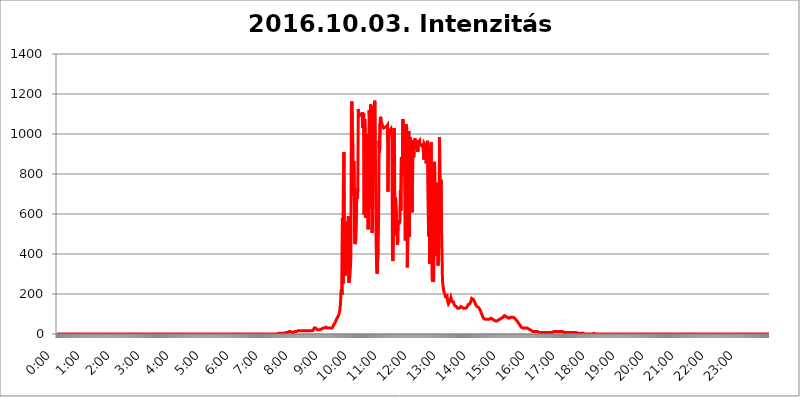
| Category | 2016.10.03. Intenzitás [W/m^2] |
|---|---|
| 0.0 | 0 |
| 0.0006944444444444445 | 0 |
| 0.001388888888888889 | 0 |
| 0.0020833333333333333 | 0 |
| 0.002777777777777778 | 0 |
| 0.003472222222222222 | 0 |
| 0.004166666666666667 | 0 |
| 0.004861111111111111 | 0 |
| 0.005555555555555556 | 0 |
| 0.0062499999999999995 | 0 |
| 0.006944444444444444 | 0 |
| 0.007638888888888889 | 0 |
| 0.008333333333333333 | 0 |
| 0.009027777777777779 | 0 |
| 0.009722222222222222 | 0 |
| 0.010416666666666666 | 0 |
| 0.011111111111111112 | 0 |
| 0.011805555555555555 | 0 |
| 0.012499999999999999 | 0 |
| 0.013194444444444444 | 0 |
| 0.013888888888888888 | 0 |
| 0.014583333333333332 | 0 |
| 0.015277777777777777 | 0 |
| 0.015972222222222224 | 0 |
| 0.016666666666666666 | 0 |
| 0.017361111111111112 | 0 |
| 0.018055555555555557 | 0 |
| 0.01875 | 0 |
| 0.019444444444444445 | 0 |
| 0.02013888888888889 | 0 |
| 0.020833333333333332 | 0 |
| 0.02152777777777778 | 0 |
| 0.022222222222222223 | 0 |
| 0.02291666666666667 | 0 |
| 0.02361111111111111 | 0 |
| 0.024305555555555556 | 0 |
| 0.024999999999999998 | 0 |
| 0.025694444444444447 | 0 |
| 0.02638888888888889 | 0 |
| 0.027083333333333334 | 0 |
| 0.027777777777777776 | 0 |
| 0.02847222222222222 | 0 |
| 0.029166666666666664 | 0 |
| 0.029861111111111113 | 0 |
| 0.030555555555555555 | 0 |
| 0.03125 | 0 |
| 0.03194444444444445 | 0 |
| 0.03263888888888889 | 0 |
| 0.03333333333333333 | 0 |
| 0.034027777777777775 | 0 |
| 0.034722222222222224 | 0 |
| 0.035416666666666666 | 0 |
| 0.036111111111111115 | 0 |
| 0.03680555555555556 | 0 |
| 0.0375 | 0 |
| 0.03819444444444444 | 0 |
| 0.03888888888888889 | 0 |
| 0.03958333333333333 | 0 |
| 0.04027777777777778 | 0 |
| 0.04097222222222222 | 0 |
| 0.041666666666666664 | 0 |
| 0.042361111111111106 | 0 |
| 0.04305555555555556 | 0 |
| 0.043750000000000004 | 0 |
| 0.044444444444444446 | 0 |
| 0.04513888888888889 | 0 |
| 0.04583333333333334 | 0 |
| 0.04652777777777778 | 0 |
| 0.04722222222222222 | 0 |
| 0.04791666666666666 | 0 |
| 0.04861111111111111 | 0 |
| 0.049305555555555554 | 0 |
| 0.049999999999999996 | 0 |
| 0.05069444444444445 | 0 |
| 0.051388888888888894 | 0 |
| 0.052083333333333336 | 0 |
| 0.05277777777777778 | 0 |
| 0.05347222222222222 | 0 |
| 0.05416666666666667 | 0 |
| 0.05486111111111111 | 0 |
| 0.05555555555555555 | 0 |
| 0.05625 | 0 |
| 0.05694444444444444 | 0 |
| 0.057638888888888885 | 0 |
| 0.05833333333333333 | 0 |
| 0.05902777777777778 | 0 |
| 0.059722222222222225 | 0 |
| 0.06041666666666667 | 0 |
| 0.061111111111111116 | 0 |
| 0.06180555555555556 | 0 |
| 0.0625 | 0 |
| 0.06319444444444444 | 0 |
| 0.06388888888888888 | 0 |
| 0.06458333333333334 | 0 |
| 0.06527777777777778 | 0 |
| 0.06597222222222222 | 0 |
| 0.06666666666666667 | 0 |
| 0.06736111111111111 | 0 |
| 0.06805555555555555 | 0 |
| 0.06874999999999999 | 0 |
| 0.06944444444444443 | 0 |
| 0.07013888888888889 | 0 |
| 0.07083333333333333 | 0 |
| 0.07152777777777779 | 0 |
| 0.07222222222222223 | 0 |
| 0.07291666666666667 | 0 |
| 0.07361111111111111 | 0 |
| 0.07430555555555556 | 0 |
| 0.075 | 0 |
| 0.07569444444444444 | 0 |
| 0.0763888888888889 | 0 |
| 0.07708333333333334 | 0 |
| 0.07777777777777778 | 0 |
| 0.07847222222222222 | 0 |
| 0.07916666666666666 | 0 |
| 0.0798611111111111 | 0 |
| 0.08055555555555556 | 0 |
| 0.08125 | 0 |
| 0.08194444444444444 | 0 |
| 0.08263888888888889 | 0 |
| 0.08333333333333333 | 0 |
| 0.08402777777777777 | 0 |
| 0.08472222222222221 | 0 |
| 0.08541666666666665 | 0 |
| 0.08611111111111112 | 0 |
| 0.08680555555555557 | 0 |
| 0.08750000000000001 | 0 |
| 0.08819444444444445 | 0 |
| 0.08888888888888889 | 0 |
| 0.08958333333333333 | 0 |
| 0.09027777777777778 | 0 |
| 0.09097222222222222 | 0 |
| 0.09166666666666667 | 0 |
| 0.09236111111111112 | 0 |
| 0.09305555555555556 | 0 |
| 0.09375 | 0 |
| 0.09444444444444444 | 0 |
| 0.09513888888888888 | 0 |
| 0.09583333333333333 | 0 |
| 0.09652777777777777 | 0 |
| 0.09722222222222222 | 0 |
| 0.09791666666666667 | 0 |
| 0.09861111111111111 | 0 |
| 0.09930555555555555 | 0 |
| 0.09999999999999999 | 0 |
| 0.10069444444444443 | 0 |
| 0.1013888888888889 | 0 |
| 0.10208333333333335 | 0 |
| 0.10277777777777779 | 0 |
| 0.10347222222222223 | 0 |
| 0.10416666666666667 | 0 |
| 0.10486111111111111 | 0 |
| 0.10555555555555556 | 0 |
| 0.10625 | 0 |
| 0.10694444444444444 | 0 |
| 0.1076388888888889 | 0 |
| 0.10833333333333334 | 0 |
| 0.10902777777777778 | 0 |
| 0.10972222222222222 | 0 |
| 0.1111111111111111 | 0 |
| 0.11180555555555556 | 0 |
| 0.11180555555555556 | 0 |
| 0.1125 | 0 |
| 0.11319444444444444 | 0 |
| 0.11388888888888889 | 0 |
| 0.11458333333333333 | 0 |
| 0.11527777777777777 | 0 |
| 0.11597222222222221 | 0 |
| 0.11666666666666665 | 0 |
| 0.1173611111111111 | 0 |
| 0.11805555555555557 | 0 |
| 0.11944444444444445 | 0 |
| 0.12013888888888889 | 0 |
| 0.12083333333333333 | 0 |
| 0.12152777777777778 | 0 |
| 0.12222222222222223 | 0 |
| 0.12291666666666667 | 0 |
| 0.12291666666666667 | 0 |
| 0.12361111111111112 | 0 |
| 0.12430555555555556 | 0 |
| 0.125 | 0 |
| 0.12569444444444444 | 0 |
| 0.12638888888888888 | 0 |
| 0.12708333333333333 | 0 |
| 0.16875 | 0 |
| 0.12847222222222224 | 0 |
| 0.12916666666666668 | 0 |
| 0.12986111111111112 | 0 |
| 0.13055555555555556 | 0 |
| 0.13125 | 0 |
| 0.13194444444444445 | 0 |
| 0.1326388888888889 | 0 |
| 0.13333333333333333 | 0 |
| 0.13402777777777777 | 0 |
| 0.13402777777777777 | 0 |
| 0.13472222222222222 | 0 |
| 0.13541666666666666 | 0 |
| 0.1361111111111111 | 0 |
| 0.13749999999999998 | 0 |
| 0.13819444444444443 | 0 |
| 0.1388888888888889 | 0 |
| 0.13958333333333334 | 0 |
| 0.14027777777777778 | 0 |
| 0.14097222222222222 | 0 |
| 0.14166666666666666 | 0 |
| 0.1423611111111111 | 0 |
| 0.14305555555555557 | 0 |
| 0.14375000000000002 | 0 |
| 0.14444444444444446 | 0 |
| 0.1451388888888889 | 0 |
| 0.1451388888888889 | 0 |
| 0.14652777777777778 | 0 |
| 0.14722222222222223 | 0 |
| 0.14791666666666667 | 0 |
| 0.1486111111111111 | 0 |
| 0.14930555555555555 | 0 |
| 0.15 | 0 |
| 0.15069444444444444 | 0 |
| 0.15138888888888888 | 0 |
| 0.15208333333333332 | 0 |
| 0.15277777777777776 | 0 |
| 0.15347222222222223 | 0 |
| 0.15416666666666667 | 0 |
| 0.15486111111111112 | 0 |
| 0.15555555555555556 | 0 |
| 0.15625 | 0 |
| 0.15694444444444444 | 0 |
| 0.15763888888888888 | 0 |
| 0.15833333333333333 | 0 |
| 0.15902777777777777 | 0 |
| 0.15972222222222224 | 0 |
| 0.16041666666666668 | 0 |
| 0.16111111111111112 | 0 |
| 0.16180555555555556 | 0 |
| 0.1625 | 0 |
| 0.16319444444444445 | 0 |
| 0.1638888888888889 | 0 |
| 0.16458333333333333 | 0 |
| 0.16527777777777777 | 0 |
| 0.16597222222222222 | 0 |
| 0.16666666666666666 | 0 |
| 0.1673611111111111 | 0 |
| 0.16805555555555554 | 0 |
| 0.16874999999999998 | 0 |
| 0.16944444444444443 | 0 |
| 0.17013888888888887 | 0 |
| 0.1708333333333333 | 0 |
| 0.17152777777777775 | 0 |
| 0.17222222222222225 | 0 |
| 0.1729166666666667 | 0 |
| 0.17361111111111113 | 0 |
| 0.17430555555555557 | 0 |
| 0.17500000000000002 | 0 |
| 0.17569444444444446 | 0 |
| 0.1763888888888889 | 0 |
| 0.17708333333333334 | 0 |
| 0.17777777777777778 | 0 |
| 0.17847222222222223 | 0 |
| 0.17916666666666667 | 0 |
| 0.1798611111111111 | 0 |
| 0.18055555555555555 | 0 |
| 0.18125 | 0 |
| 0.18194444444444444 | 0 |
| 0.1826388888888889 | 0 |
| 0.18333333333333335 | 0 |
| 0.1840277777777778 | 0 |
| 0.18472222222222223 | 0 |
| 0.18541666666666667 | 0 |
| 0.18611111111111112 | 0 |
| 0.18680555555555556 | 0 |
| 0.1875 | 0 |
| 0.18819444444444444 | 0 |
| 0.18888888888888888 | 0 |
| 0.18958333333333333 | 0 |
| 0.19027777777777777 | 0 |
| 0.1909722222222222 | 0 |
| 0.19166666666666665 | 0 |
| 0.19236111111111112 | 0 |
| 0.19305555555555554 | 0 |
| 0.19375 | 0 |
| 0.19444444444444445 | 0 |
| 0.1951388888888889 | 0 |
| 0.19583333333333333 | 0 |
| 0.19652777777777777 | 0 |
| 0.19722222222222222 | 0 |
| 0.19791666666666666 | 0 |
| 0.1986111111111111 | 0 |
| 0.19930555555555554 | 0 |
| 0.19999999999999998 | 0 |
| 0.20069444444444443 | 0 |
| 0.20138888888888887 | 0 |
| 0.2020833333333333 | 0 |
| 0.2027777777777778 | 0 |
| 0.2034722222222222 | 0 |
| 0.2041666666666667 | 0 |
| 0.20486111111111113 | 0 |
| 0.20555555555555557 | 0 |
| 0.20625000000000002 | 0 |
| 0.20694444444444446 | 0 |
| 0.2076388888888889 | 0 |
| 0.20833333333333334 | 0 |
| 0.20902777777777778 | 0 |
| 0.20972222222222223 | 0 |
| 0.21041666666666667 | 0 |
| 0.2111111111111111 | 0 |
| 0.21180555555555555 | 0 |
| 0.2125 | 0 |
| 0.21319444444444444 | 0 |
| 0.2138888888888889 | 0 |
| 0.21458333333333335 | 0 |
| 0.2152777777777778 | 0 |
| 0.21597222222222223 | 0 |
| 0.21666666666666667 | 0 |
| 0.21736111111111112 | 0 |
| 0.21805555555555556 | 0 |
| 0.21875 | 0 |
| 0.21944444444444444 | 0 |
| 0.22013888888888888 | 0 |
| 0.22083333333333333 | 0 |
| 0.22152777777777777 | 0 |
| 0.2222222222222222 | 0 |
| 0.22291666666666665 | 0 |
| 0.2236111111111111 | 0 |
| 0.22430555555555556 | 0 |
| 0.225 | 0 |
| 0.22569444444444445 | 0 |
| 0.2263888888888889 | 0 |
| 0.22708333333333333 | 0 |
| 0.22777777777777777 | 0 |
| 0.22847222222222222 | 0 |
| 0.22916666666666666 | 0 |
| 0.2298611111111111 | 0 |
| 0.23055555555555554 | 0 |
| 0.23124999999999998 | 0 |
| 0.23194444444444443 | 0 |
| 0.23263888888888887 | 0 |
| 0.2333333333333333 | 0 |
| 0.2340277777777778 | 0 |
| 0.2347222222222222 | 0 |
| 0.2354166666666667 | 0 |
| 0.23611111111111113 | 0 |
| 0.23680555555555557 | 0 |
| 0.23750000000000002 | 0 |
| 0.23819444444444446 | 0 |
| 0.2388888888888889 | 0 |
| 0.23958333333333334 | 0 |
| 0.24027777777777778 | 0 |
| 0.24097222222222223 | 0 |
| 0.24166666666666667 | 0 |
| 0.2423611111111111 | 0 |
| 0.24305555555555555 | 0 |
| 0.24375 | 0 |
| 0.24444444444444446 | 0 |
| 0.24513888888888888 | 0 |
| 0.24583333333333335 | 0 |
| 0.2465277777777778 | 0 |
| 0.24722222222222223 | 0 |
| 0.24791666666666667 | 0 |
| 0.24861111111111112 | 0 |
| 0.24930555555555556 | 0 |
| 0.25 | 0 |
| 0.25069444444444444 | 0 |
| 0.2513888888888889 | 0 |
| 0.2520833333333333 | 0 |
| 0.25277777777777777 | 0 |
| 0.2534722222222222 | 0 |
| 0.25416666666666665 | 0 |
| 0.2548611111111111 | 0 |
| 0.2555555555555556 | 0 |
| 0.25625000000000003 | 0 |
| 0.2569444444444445 | 0 |
| 0.2576388888888889 | 0 |
| 0.25833333333333336 | 0 |
| 0.2590277777777778 | 0 |
| 0.25972222222222224 | 0 |
| 0.2604166666666667 | 0 |
| 0.2611111111111111 | 0 |
| 0.26180555555555557 | 0 |
| 0.2625 | 0 |
| 0.26319444444444445 | 0 |
| 0.2638888888888889 | 0 |
| 0.26458333333333334 | 0 |
| 0.2652777777777778 | 0 |
| 0.2659722222222222 | 0 |
| 0.26666666666666666 | 0 |
| 0.2673611111111111 | 0 |
| 0.26805555555555555 | 0 |
| 0.26875 | 0 |
| 0.26944444444444443 | 0 |
| 0.2701388888888889 | 0 |
| 0.2708333333333333 | 0 |
| 0.27152777777777776 | 0 |
| 0.2722222222222222 | 0 |
| 0.27291666666666664 | 0 |
| 0.2736111111111111 | 0 |
| 0.2743055555555555 | 0 |
| 0.27499999999999997 | 0 |
| 0.27569444444444446 | 0 |
| 0.27638888888888885 | 0 |
| 0.27708333333333335 | 0 |
| 0.2777777777777778 | 0 |
| 0.27847222222222223 | 0 |
| 0.2791666666666667 | 0 |
| 0.2798611111111111 | 0 |
| 0.28055555555555556 | 0 |
| 0.28125 | 0 |
| 0.28194444444444444 | 0 |
| 0.2826388888888889 | 0 |
| 0.2833333333333333 | 0 |
| 0.28402777777777777 | 0 |
| 0.2847222222222222 | 0 |
| 0.28541666666666665 | 0 |
| 0.28611111111111115 | 0 |
| 0.28680555555555554 | 0 |
| 0.28750000000000003 | 0 |
| 0.2881944444444445 | 0 |
| 0.2888888888888889 | 0 |
| 0.28958333333333336 | 0 |
| 0.2902777777777778 | 0 |
| 0.29097222222222224 | 0 |
| 0.2916666666666667 | 0 |
| 0.2923611111111111 | 0 |
| 0.29305555555555557 | 0 |
| 0.29375 | 0 |
| 0.29444444444444445 | 0 |
| 0.2951388888888889 | 0 |
| 0.29583333333333334 | 0 |
| 0.2965277777777778 | 0 |
| 0.2972222222222222 | 0 |
| 0.29791666666666666 | 0 |
| 0.2986111111111111 | 0 |
| 0.29930555555555555 | 0 |
| 0.3 | 0 |
| 0.30069444444444443 | 0 |
| 0.3013888888888889 | 0 |
| 0.3020833333333333 | 0 |
| 0.30277777777777776 | 0 |
| 0.3034722222222222 | 0 |
| 0.30416666666666664 | 0 |
| 0.3048611111111111 | 0 |
| 0.3055555555555555 | 0 |
| 0.30624999999999997 | 0 |
| 0.3069444444444444 | 0 |
| 0.3076388888888889 | 0 |
| 0.30833333333333335 | 0 |
| 0.3090277777777778 | 3.525 |
| 0.30972222222222223 | 3.525 |
| 0.3104166666666667 | 3.525 |
| 0.3111111111111111 | 3.525 |
| 0.31180555555555556 | 3.525 |
| 0.3125 | 3.525 |
| 0.31319444444444444 | 3.525 |
| 0.3138888888888889 | 3.525 |
| 0.3145833333333333 | 3.525 |
| 0.31527777777777777 | 3.525 |
| 0.3159722222222222 | 3.525 |
| 0.31666666666666665 | 3.525 |
| 0.31736111111111115 | 3.525 |
| 0.31805555555555554 | 3.525 |
| 0.31875000000000003 | 3.525 |
| 0.3194444444444445 | 3.525 |
| 0.3201388888888889 | 7.887 |
| 0.32083333333333336 | 7.887 |
| 0.3215277777777778 | 7.887 |
| 0.32222222222222224 | 7.887 |
| 0.3229166666666667 | 7.887 |
| 0.3236111111111111 | 7.887 |
| 0.32430555555555557 | 7.887 |
| 0.325 | 12.257 |
| 0.32569444444444445 | 12.257 |
| 0.3263888888888889 | 12.257 |
| 0.32708333333333334 | 12.257 |
| 0.3277777777777778 | 12.257 |
| 0.3284722222222222 | 12.257 |
| 0.32916666666666666 | 7.887 |
| 0.3298611111111111 | 7.887 |
| 0.33055555555555555 | 7.887 |
| 0.33125 | 7.887 |
| 0.33194444444444443 | 12.257 |
| 0.3326388888888889 | 12.257 |
| 0.3333333333333333 | 12.257 |
| 0.3340277777777778 | 12.257 |
| 0.3347222222222222 | 12.257 |
| 0.3354166666666667 | 12.257 |
| 0.3361111111111111 | 12.257 |
| 0.3368055555555556 | 12.257 |
| 0.33749999999999997 | 16.636 |
| 0.33819444444444446 | 16.636 |
| 0.33888888888888885 | 16.636 |
| 0.33958333333333335 | 16.636 |
| 0.34027777777777773 | 16.636 |
| 0.34097222222222223 | 16.636 |
| 0.3416666666666666 | 16.636 |
| 0.3423611111111111 | 16.636 |
| 0.3430555555555555 | 16.636 |
| 0.34375 | 16.636 |
| 0.3444444444444445 | 16.636 |
| 0.3451388888888889 | 16.636 |
| 0.3458333333333334 | 16.636 |
| 0.34652777777777777 | 16.636 |
| 0.34722222222222227 | 16.636 |
| 0.34791666666666665 | 16.636 |
| 0.34861111111111115 | 16.636 |
| 0.34930555555555554 | 16.636 |
| 0.35000000000000003 | 16.636 |
| 0.3506944444444444 | 16.636 |
| 0.3513888888888889 | 16.636 |
| 0.3520833333333333 | 16.636 |
| 0.3527777777777778 | 16.636 |
| 0.3534722222222222 | 16.636 |
| 0.3541666666666667 | 16.636 |
| 0.3548611111111111 | 16.636 |
| 0.35555555555555557 | 16.636 |
| 0.35625 | 16.636 |
| 0.35694444444444445 | 16.636 |
| 0.3576388888888889 | 16.636 |
| 0.35833333333333334 | 16.636 |
| 0.3590277777777778 | 21.024 |
| 0.3597222222222222 | 21.024 |
| 0.36041666666666666 | 29.823 |
| 0.3611111111111111 | 29.823 |
| 0.36180555555555555 | 29.823 |
| 0.3625 | 29.823 |
| 0.36319444444444443 | 25.419 |
| 0.3638888888888889 | 25.419 |
| 0.3645833333333333 | 21.024 |
| 0.3652777777777778 | 21.024 |
| 0.3659722222222222 | 21.024 |
| 0.3666666666666667 | 21.024 |
| 0.3673611111111111 | 21.024 |
| 0.3680555555555556 | 21.024 |
| 0.36874999999999997 | 21.024 |
| 0.36944444444444446 | 21.024 |
| 0.37013888888888885 | 25.419 |
| 0.37083333333333335 | 25.419 |
| 0.37152777777777773 | 25.419 |
| 0.37222222222222223 | 25.419 |
| 0.3729166666666666 | 29.823 |
| 0.3736111111111111 | 29.823 |
| 0.3743055555555555 | 29.823 |
| 0.375 | 29.823 |
| 0.3756944444444445 | 29.823 |
| 0.3763888888888889 | 29.823 |
| 0.3770833333333334 | 34.234 |
| 0.37777777777777777 | 29.823 |
| 0.37847222222222227 | 29.823 |
| 0.37916666666666665 | 29.823 |
| 0.37986111111111115 | 29.823 |
| 0.38055555555555554 | 29.823 |
| 0.38125000000000003 | 29.823 |
| 0.3819444444444444 | 29.823 |
| 0.3826388888888889 | 29.823 |
| 0.3833333333333333 | 29.823 |
| 0.3840277777777778 | 29.823 |
| 0.3847222222222222 | 29.823 |
| 0.3854166666666667 | 29.823 |
| 0.3861111111111111 | 34.234 |
| 0.38680555555555557 | 34.234 |
| 0.3875 | 43.079 |
| 0.38819444444444445 | 47.511 |
| 0.3888888888888889 | 51.951 |
| 0.38958333333333334 | 56.398 |
| 0.3902777777777778 | 60.85 |
| 0.3909722222222222 | 65.31 |
| 0.39166666666666666 | 74.246 |
| 0.3923611111111111 | 78.722 |
| 0.39305555555555555 | 83.205 |
| 0.39375 | 87.692 |
| 0.39444444444444443 | 92.184 |
| 0.3951388888888889 | 101.184 |
| 0.3958333333333333 | 110.201 |
| 0.3965277777777778 | 128.284 |
| 0.3972222222222222 | 146.423 |
| 0.3979166666666667 | 214.746 |
| 0.3986111111111111 | 223.873 |
| 0.3993055555555556 | 196.497 |
| 0.39999999999999997 | 579.542 |
| 0.40069444444444446 | 251.251 |
| 0.40138888888888885 | 775.492 |
| 0.40208333333333335 | 909.996 |
| 0.40277777777777773 | 319.517 |
| 0.40347222222222223 | 333.113 |
| 0.4041666666666666 | 292.259 |
| 0.4048611111111111 | 296.808 |
| 0.4055555555555555 | 373.729 |
| 0.40625 | 445.129 |
| 0.4069444444444445 | 562.53 |
| 0.4076388888888889 | 431.833 |
| 0.4083333333333334 | 588.009 |
| 0.40902777777777777 | 255.813 |
| 0.40972222222222227 | 255.813 |
| 0.41041666666666665 | 287.709 |
| 0.41111111111111115 | 328.584 |
| 0.41180555555555554 | 378.224 |
| 0.41250000000000003 | 1116.426 |
| 0.4131944444444444 | 1162.571 |
| 0.4138888888888889 | 1059.756 |
| 0.4145833333333333 | 962.555 |
| 0.4152777777777778 | 691.608 |
| 0.4159722222222222 | 864.493 |
| 0.4166666666666667 | 868.305 |
| 0.4173611111111111 | 449.551 |
| 0.41805555555555557 | 453.968 |
| 0.41875 | 471.582 |
| 0.41944444444444445 | 541.121 |
| 0.4201388888888889 | 723.889 |
| 0.42083333333333334 | 675.311 |
| 0.4215277777777778 | 727.896 |
| 0.4222222222222222 | 1124.056 |
| 0.42291666666666666 | 1089.873 |
| 0.4236111111111111 | 1089.873 |
| 0.42430555555555555 | 1093.653 |
| 0.425 | 1093.653 |
| 0.42569444444444443 | 1097.437 |
| 0.4263888888888889 | 1097.437 |
| 0.4270833333333333 | 1101.226 |
| 0.4277777777777778 | 1108.816 |
| 0.4284722222222222 | 1029.798 |
| 0.4291666666666667 | 1097.437 |
| 0.4298611111111111 | 1105.019 |
| 0.4305555555555556 | 596.45 |
| 0.43124999999999997 | 1074.789 |
| 0.43194444444444446 | 955.071 |
| 0.43263888888888885 | 579.542 |
| 0.43333333333333335 | 767.62 |
| 0.43402777777777773 | 650.667 |
| 0.43472222222222223 | 775.492 |
| 0.4354166666666666 | 999.916 |
| 0.4361111111111111 | 523.88 |
| 0.4368055555555555 | 675.311 |
| 0.4375 | 1120.238 |
| 0.4381944444444445 | 1044.762 |
| 0.4388888888888889 | 829.981 |
| 0.4395833333333334 | 1147.086 |
| 0.44027777777777777 | 625.784 |
| 0.44097222222222227 | 1108.816 |
| 0.44166666666666665 | 506.542 |
| 0.44236111111111115 | 646.537 |
| 0.44305555555555554 | 1011.118 |
| 0.44375000000000003 | 1139.384 |
| 0.4444444444444444 | 1022.323 |
| 0.4451388888888889 | 1166.46 |
| 0.4458333333333333 | 1147.086 |
| 0.4465277777777778 | 759.723 |
| 0.4472222222222222 | 458.38 |
| 0.4479166666666667 | 333.113 |
| 0.4486111111111111 | 301.354 |
| 0.44930555555555557 | 305.898 |
| 0.45 | 427.39 |
| 0.45069444444444445 | 579.542 |
| 0.4513888888888889 | 966.295 |
| 0.45208333333333334 | 906.223 |
| 0.4527777777777778 | 1052.255 |
| 0.4534722222222222 | 1086.097 |
| 0.45416666666666666 | 1067.267 |
| 0.4548611111111111 | 1059.756 |
| 0.45555555555555555 | 1048.508 |
| 0.45625 | 1041.019 |
| 0.45694444444444443 | 1037.277 |
| 0.4576388888888889 | 1029.798 |
| 0.4583333333333333 | 1029.798 |
| 0.4590277777777778 | 1033.537 |
| 0.4597222222222222 | 1033.537 |
| 0.4604166666666667 | 1037.277 |
| 0.4611111111111111 | 1037.277 |
| 0.4618055555555556 | 1037.277 |
| 0.46249999999999997 | 1037.277 |
| 0.46319444444444446 | 1044.762 |
| 0.46388888888888885 | 711.832 |
| 0.46458333333333335 | 1018.587 |
| 0.46527777777777773 | 1022.323 |
| 0.46597222222222223 | 1018.587 |
| 0.4666666666666666 | 1018.587 |
| 0.4673611111111111 | 1018.587 |
| 0.4680555555555555 | 1026.06 |
| 0.46875 | 1029.798 |
| 0.4694444444444445 | 981.244 |
| 0.4701388888888889 | 391.685 |
| 0.4708333333333334 | 364.728 |
| 0.47152777777777777 | 617.436 |
| 0.47222222222222227 | 1029.798 |
| 0.47291666666666665 | 1014.852 |
| 0.47361111111111115 | 493.475 |
| 0.47430555555555554 | 683.473 |
| 0.47500000000000003 | 663.019 |
| 0.4756944444444444 | 663.019 |
| 0.4763888888888889 | 553.986 |
| 0.4770833333333333 | 445.129 |
| 0.4777777777777778 | 471.582 |
| 0.4784722222222222 | 566.793 |
| 0.4791666666666667 | 549.704 |
| 0.4798611111111111 | 549.704 |
| 0.48055555555555557 | 566.793 |
| 0.48125 | 719.877 |
| 0.48194444444444445 | 617.436 |
| 0.4826388888888889 | 883.516 |
| 0.48333333333333334 | 856.855 |
| 0.4840277777777778 | 795.074 |
| 0.4847222222222222 | 1074.789 |
| 0.48541666666666666 | 1022.323 |
| 0.4861111111111111 | 981.244 |
| 0.48680555555555555 | 936.33 |
| 0.4875 | 679.395 |
| 0.48819444444444443 | 467.187 |
| 0.4888888888888889 | 1048.508 |
| 0.4895833333333333 | 1041.019 |
| 0.4902777777777778 | 1033.537 |
| 0.4909722222222222 | 333.113 |
| 0.4916666666666667 | 493.475 |
| 0.4923611111111111 | 928.819 |
| 0.4930555555555556 | 1014.852 |
| 0.49374999999999997 | 484.735 |
| 0.49444444444444446 | 984.98 |
| 0.49513888888888885 | 970.034 |
| 0.49583333333333335 | 966.295 |
| 0.49652777777777773 | 962.555 |
| 0.49722222222222223 | 970.034 |
| 0.4979166666666666 | 609.062 |
| 0.4986111111111111 | 891.099 |
| 0.4993055555555555 | 913.766 |
| 0.5 | 883.516 |
| 0.5006944444444444 | 879.719 |
| 0.5013888888888889 | 977.508 |
| 0.5020833333333333 | 970.034 |
| 0.5027777777777778 | 932.576 |
| 0.5034722222222222 | 966.295 |
| 0.5041666666666667 | 925.06 |
| 0.5048611111111111 | 970.034 |
| 0.5055555555555555 | 909.996 |
| 0.50625 | 932.576 |
| 0.5069444444444444 | 958.814 |
| 0.5076388888888889 | 962.555 |
| 0.5083333333333333 | 966.295 |
| 0.5090277777777777 | 947.58 |
| 0.5097222222222222 | 943.832 |
| 0.5104166666666666 | 943.832 |
| 0.5111111111111112 | 940.082 |
| 0.5118055555555555 | 940.082 |
| 0.5125000000000001 | 936.33 |
| 0.5131944444444444 | 947.58 |
| 0.513888888888889 | 872.114 |
| 0.5145833333333333 | 955.071 |
| 0.5152777777777778 | 951.327 |
| 0.5159722222222222 | 947.58 |
| 0.5166666666666667 | 909.996 |
| 0.517361111111111 | 853.029 |
| 0.5180555555555556 | 853.029 |
| 0.5187499999999999 | 894.885 |
| 0.5194444444444445 | 966.295 |
| 0.5201388888888888 | 966.295 |
| 0.5208333333333334 | 489.108 |
| 0.5215277777777778 | 932.576 |
| 0.5222222222222223 | 351.198 |
| 0.5229166666666667 | 445.129 |
| 0.5236111111111111 | 795.074 |
| 0.5243055555555556 | 958.814 |
| 0.525 | 691.608 |
| 0.5256944444444445 | 278.603 |
| 0.5263888888888889 | 260.373 |
| 0.5270833333333333 | 387.202 |
| 0.5277777777777778 | 260.373 |
| 0.5284722222222222 | 264.932 |
| 0.5291666666666667 | 860.676 |
| 0.5298611111111111 | 667.123 |
| 0.5305555555555556 | 391.685 |
| 0.53125 | 609.062 |
| 0.5319444444444444 | 755.766 |
| 0.5326388888888889 | 462.786 |
| 0.5333333333333333 | 409.574 |
| 0.5340277777777778 | 342.162 |
| 0.5347222222222222 | 387.202 |
| 0.5354166666666667 | 445.129 |
| 0.5361111111111111 | 984.98 |
| 0.5368055555555555 | 747.834 |
| 0.5375 | 667.123 |
| 0.5381944444444444 | 771.559 |
| 0.5388888888888889 | 545.416 |
| 0.5395833333333333 | 405.108 |
| 0.5402777777777777 | 269.49 |
| 0.5409722222222222 | 242.127 |
| 0.5416666666666666 | 228.436 |
| 0.5423611111111112 | 210.182 |
| 0.5430555555555555 | 210.182 |
| 0.5437500000000001 | 196.497 |
| 0.5444444444444444 | 187.378 |
| 0.545138888888889 | 187.378 |
| 0.5458333333333333 | 191.937 |
| 0.5465277777777778 | 191.937 |
| 0.5472222222222222 | 173.709 |
| 0.5479166666666667 | 160.056 |
| 0.548611111111111 | 150.964 |
| 0.5493055555555556 | 146.423 |
| 0.5499999999999999 | 150.964 |
| 0.5506944444444445 | 164.605 |
| 0.5513888888888888 | 173.709 |
| 0.5520833333333334 | 182.82 |
| 0.5527777777777778 | 173.709 |
| 0.5534722222222223 | 164.605 |
| 0.5541666666666667 | 169.156 |
| 0.5548611111111111 | 164.605 |
| 0.5555555555555556 | 160.056 |
| 0.55625 | 150.964 |
| 0.5569444444444445 | 146.423 |
| 0.5576388888888889 | 141.884 |
| 0.5583333333333333 | 137.347 |
| 0.5590277777777778 | 137.347 |
| 0.5597222222222222 | 137.347 |
| 0.5604166666666667 | 132.814 |
| 0.5611111111111111 | 132.814 |
| 0.5618055555555556 | 128.284 |
| 0.5625 | 128.284 |
| 0.5631944444444444 | 128.284 |
| 0.5638888888888889 | 128.284 |
| 0.5645833333333333 | 128.284 |
| 0.5652777777777778 | 132.814 |
| 0.5659722222222222 | 137.347 |
| 0.5666666666666667 | 137.347 |
| 0.5673611111111111 | 137.347 |
| 0.5680555555555555 | 132.814 |
| 0.56875 | 132.814 |
| 0.5694444444444444 | 128.284 |
| 0.5701388888888889 | 128.284 |
| 0.5708333333333333 | 123.758 |
| 0.5715277777777777 | 128.284 |
| 0.5722222222222222 | 128.284 |
| 0.5729166666666666 | 128.284 |
| 0.5736111111111112 | 128.284 |
| 0.5743055555555555 | 132.814 |
| 0.5750000000000001 | 137.347 |
| 0.5756944444444444 | 137.347 |
| 0.576388888888889 | 146.423 |
| 0.5770833333333333 | 146.423 |
| 0.5777777777777778 | 150.964 |
| 0.5784722222222222 | 150.964 |
| 0.5791666666666667 | 155.509 |
| 0.579861111111111 | 160.056 |
| 0.5805555555555556 | 169.156 |
| 0.5812499999999999 | 178.264 |
| 0.5819444444444445 | 178.264 |
| 0.5826388888888888 | 178.264 |
| 0.5833333333333334 | 173.709 |
| 0.5840277777777778 | 173.709 |
| 0.5847222222222223 | 164.605 |
| 0.5854166666666667 | 160.056 |
| 0.5861111111111111 | 155.509 |
| 0.5868055555555556 | 146.423 |
| 0.5875 | 146.423 |
| 0.5881944444444445 | 141.884 |
| 0.5888888888888889 | 137.347 |
| 0.5895833333333333 | 137.347 |
| 0.5902777777777778 | 132.814 |
| 0.5909722222222222 | 132.814 |
| 0.5916666666666667 | 128.284 |
| 0.5923611111111111 | 123.758 |
| 0.5930555555555556 | 119.235 |
| 0.59375 | 114.716 |
| 0.5944444444444444 | 105.69 |
| 0.5951388888888889 | 101.184 |
| 0.5958333333333333 | 96.682 |
| 0.5965277777777778 | 87.692 |
| 0.5972222222222222 | 83.205 |
| 0.5979166666666667 | 78.722 |
| 0.5986111111111111 | 74.246 |
| 0.5993055555555555 | 74.246 |
| 0.6 | 74.246 |
| 0.6006944444444444 | 74.246 |
| 0.6013888888888889 | 74.246 |
| 0.6020833333333333 | 74.246 |
| 0.6027777777777777 | 74.246 |
| 0.6034722222222222 | 74.246 |
| 0.6041666666666666 | 74.246 |
| 0.6048611111111112 | 74.246 |
| 0.6055555555555555 | 74.246 |
| 0.6062500000000001 | 74.246 |
| 0.6069444444444444 | 74.246 |
| 0.607638888888889 | 74.246 |
| 0.6083333333333333 | 78.722 |
| 0.6090277777777778 | 78.722 |
| 0.6097222222222222 | 78.722 |
| 0.6104166666666667 | 74.246 |
| 0.611111111111111 | 74.246 |
| 0.6118055555555556 | 74.246 |
| 0.6124999999999999 | 69.775 |
| 0.6131944444444445 | 65.31 |
| 0.6138888888888888 | 65.31 |
| 0.6145833333333334 | 65.31 |
| 0.6152777777777778 | 65.31 |
| 0.6159722222222223 | 65.31 |
| 0.6166666666666667 | 65.31 |
| 0.6173611111111111 | 65.31 |
| 0.6180555555555556 | 65.31 |
| 0.61875 | 69.775 |
| 0.6194444444444445 | 69.775 |
| 0.6201388888888889 | 69.775 |
| 0.6208333333333333 | 74.246 |
| 0.6215277777777778 | 74.246 |
| 0.6222222222222222 | 74.246 |
| 0.6229166666666667 | 78.722 |
| 0.6236111111111111 | 78.722 |
| 0.6243055555555556 | 83.205 |
| 0.625 | 83.205 |
| 0.6256944444444444 | 87.692 |
| 0.6263888888888889 | 87.692 |
| 0.6270833333333333 | 92.184 |
| 0.6277777777777778 | 92.184 |
| 0.6284722222222222 | 87.692 |
| 0.6291666666666667 | 87.692 |
| 0.6298611111111111 | 87.692 |
| 0.6305555555555555 | 83.205 |
| 0.63125 | 83.205 |
| 0.6319444444444444 | 83.205 |
| 0.6326388888888889 | 83.205 |
| 0.6333333333333333 | 78.722 |
| 0.6340277777777777 | 83.205 |
| 0.6347222222222222 | 83.205 |
| 0.6354166666666666 | 83.205 |
| 0.6361111111111112 | 83.205 |
| 0.6368055555555555 | 83.205 |
| 0.6375000000000001 | 83.205 |
| 0.6381944444444444 | 83.205 |
| 0.638888888888889 | 83.205 |
| 0.6395833333333333 | 83.205 |
| 0.6402777777777778 | 83.205 |
| 0.6409722222222222 | 78.722 |
| 0.6416666666666667 | 78.722 |
| 0.642361111111111 | 74.246 |
| 0.6430555555555556 | 74.246 |
| 0.6437499999999999 | 69.775 |
| 0.6444444444444445 | 65.31 |
| 0.6451388888888888 | 65.31 |
| 0.6458333333333334 | 60.85 |
| 0.6465277777777778 | 56.398 |
| 0.6472222222222223 | 51.951 |
| 0.6479166666666667 | 47.511 |
| 0.6486111111111111 | 47.511 |
| 0.6493055555555556 | 43.079 |
| 0.65 | 38.653 |
| 0.6506944444444445 | 34.234 |
| 0.6513888888888889 | 34.234 |
| 0.6520833333333333 | 29.823 |
| 0.6527777777777778 | 29.823 |
| 0.6534722222222222 | 29.823 |
| 0.6541666666666667 | 29.823 |
| 0.6548611111111111 | 29.823 |
| 0.6555555555555556 | 29.823 |
| 0.65625 | 29.823 |
| 0.6569444444444444 | 29.823 |
| 0.6576388888888889 | 29.823 |
| 0.6583333333333333 | 29.823 |
| 0.6590277777777778 | 29.823 |
| 0.6597222222222222 | 29.823 |
| 0.6604166666666667 | 25.419 |
| 0.6611111111111111 | 25.419 |
| 0.6618055555555555 | 21.024 |
| 0.6625 | 21.024 |
| 0.6631944444444444 | 21.024 |
| 0.6638888888888889 | 16.636 |
| 0.6645833333333333 | 16.636 |
| 0.6652777777777777 | 16.636 |
| 0.6659722222222222 | 12.257 |
| 0.6666666666666666 | 12.257 |
| 0.6673611111111111 | 12.257 |
| 0.6680555555555556 | 12.257 |
| 0.6687500000000001 | 12.257 |
| 0.6694444444444444 | 12.257 |
| 0.6701388888888888 | 12.257 |
| 0.6708333333333334 | 12.257 |
| 0.6715277777777778 | 12.257 |
| 0.6722222222222222 | 12.257 |
| 0.6729166666666666 | 12.257 |
| 0.6736111111111112 | 12.257 |
| 0.6743055555555556 | 12.257 |
| 0.6749999999999999 | 7.887 |
| 0.6756944444444444 | 7.887 |
| 0.6763888888888889 | 7.887 |
| 0.6770833333333334 | 7.887 |
| 0.6777777777777777 | 7.887 |
| 0.6784722222222223 | 7.887 |
| 0.6791666666666667 | 7.887 |
| 0.6798611111111111 | 7.887 |
| 0.6805555555555555 | 7.887 |
| 0.68125 | 7.887 |
| 0.6819444444444445 | 7.887 |
| 0.6826388888888889 | 7.887 |
| 0.6833333333333332 | 7.887 |
| 0.6840277777777778 | 7.887 |
| 0.6847222222222222 | 7.887 |
| 0.6854166666666667 | 7.887 |
| 0.686111111111111 | 7.887 |
| 0.6868055555555556 | 7.887 |
| 0.6875 | 7.887 |
| 0.6881944444444444 | 7.887 |
| 0.688888888888889 | 3.525 |
| 0.6895833333333333 | 7.887 |
| 0.6902777777777778 | 7.887 |
| 0.6909722222222222 | 7.887 |
| 0.6916666666666668 | 7.887 |
| 0.6923611111111111 | 7.887 |
| 0.6930555555555555 | 7.887 |
| 0.69375 | 7.887 |
| 0.6944444444444445 | 7.887 |
| 0.6951388888888889 | 12.257 |
| 0.6958333333333333 | 12.257 |
| 0.6965277777777777 | 12.257 |
| 0.6972222222222223 | 12.257 |
| 0.6979166666666666 | 12.257 |
| 0.6986111111111111 | 12.257 |
| 0.6993055555555556 | 12.257 |
| 0.7000000000000001 | 12.257 |
| 0.7006944444444444 | 12.257 |
| 0.7013888888888888 | 12.257 |
| 0.7020833333333334 | 12.257 |
| 0.7027777777777778 | 12.257 |
| 0.7034722222222222 | 12.257 |
| 0.7041666666666666 | 12.257 |
| 0.7048611111111112 | 12.257 |
| 0.7055555555555556 | 12.257 |
| 0.7062499999999999 | 12.257 |
| 0.7069444444444444 | 12.257 |
| 0.7076388888888889 | 12.257 |
| 0.7083333333333334 | 12.257 |
| 0.7090277777777777 | 12.257 |
| 0.7097222222222223 | 12.257 |
| 0.7104166666666667 | 12.257 |
| 0.7111111111111111 | 7.887 |
| 0.7118055555555555 | 7.887 |
| 0.7125 | 7.887 |
| 0.7131944444444445 | 7.887 |
| 0.7138888888888889 | 7.887 |
| 0.7145833333333332 | 7.887 |
| 0.7152777777777778 | 7.887 |
| 0.7159722222222222 | 7.887 |
| 0.7166666666666667 | 7.887 |
| 0.717361111111111 | 7.887 |
| 0.7180555555555556 | 7.887 |
| 0.71875 | 7.887 |
| 0.7194444444444444 | 7.887 |
| 0.720138888888889 | 7.887 |
| 0.7208333333333333 | 7.887 |
| 0.7215277777777778 | 7.887 |
| 0.7222222222222222 | 7.887 |
| 0.7229166666666668 | 7.887 |
| 0.7236111111111111 | 7.887 |
| 0.7243055555555555 | 7.887 |
| 0.725 | 7.887 |
| 0.7256944444444445 | 7.887 |
| 0.7263888888888889 | 7.887 |
| 0.7270833333333333 | 7.887 |
| 0.7277777777777777 | 7.887 |
| 0.7284722222222223 | 3.525 |
| 0.7291666666666666 | 3.525 |
| 0.7298611111111111 | 3.525 |
| 0.7305555555555556 | 3.525 |
| 0.7312500000000001 | 3.525 |
| 0.7319444444444444 | 3.525 |
| 0.7326388888888888 | 3.525 |
| 0.7333333333333334 | 3.525 |
| 0.7340277777777778 | 3.525 |
| 0.7347222222222222 | 3.525 |
| 0.7354166666666666 | 3.525 |
| 0.7361111111111112 | 3.525 |
| 0.7368055555555556 | 3.525 |
| 0.7374999999999999 | 3.525 |
| 0.7381944444444444 | 3.525 |
| 0.7388888888888889 | 0 |
| 0.7395833333333334 | 0 |
| 0.7402777777777777 | 0 |
| 0.7409722222222223 | 0 |
| 0.7416666666666667 | 0 |
| 0.7423611111111111 | 0 |
| 0.7430555555555555 | 0 |
| 0.74375 | 0 |
| 0.7444444444444445 | 0 |
| 0.7451388888888889 | 0 |
| 0.7458333333333332 | 0 |
| 0.7465277777777778 | 0 |
| 0.7472222222222222 | 0 |
| 0.7479166666666667 | 0 |
| 0.748611111111111 | 0 |
| 0.7493055555555556 | 0 |
| 0.75 | 0 |
| 0.7506944444444444 | 0 |
| 0.751388888888889 | 0 |
| 0.7520833333333333 | 0 |
| 0.7527777777777778 | 3.525 |
| 0.7534722222222222 | 3.525 |
| 0.7541666666666668 | 0 |
| 0.7548611111111111 | 0 |
| 0.7555555555555555 | 0 |
| 0.75625 | 0 |
| 0.7569444444444445 | 0 |
| 0.7576388888888889 | 0 |
| 0.7583333333333333 | 0 |
| 0.7590277777777777 | 0 |
| 0.7597222222222223 | 0 |
| 0.7604166666666666 | 0 |
| 0.7611111111111111 | 0 |
| 0.7618055555555556 | 0 |
| 0.7625000000000001 | 0 |
| 0.7631944444444444 | 0 |
| 0.7638888888888888 | 0 |
| 0.7645833333333334 | 0 |
| 0.7652777777777778 | 0 |
| 0.7659722222222222 | 0 |
| 0.7666666666666666 | 0 |
| 0.7673611111111112 | 0 |
| 0.7680555555555556 | 0 |
| 0.7687499999999999 | 0 |
| 0.7694444444444444 | 0 |
| 0.7701388888888889 | 0 |
| 0.7708333333333334 | 0 |
| 0.7715277777777777 | 0 |
| 0.7722222222222223 | 0 |
| 0.7729166666666667 | 0 |
| 0.7736111111111111 | 0 |
| 0.7743055555555555 | 0 |
| 0.775 | 0 |
| 0.7756944444444445 | 0 |
| 0.7763888888888889 | 0 |
| 0.7770833333333332 | 0 |
| 0.7777777777777778 | 0 |
| 0.7784722222222222 | 0 |
| 0.7791666666666667 | 0 |
| 0.779861111111111 | 0 |
| 0.7805555555555556 | 0 |
| 0.78125 | 0 |
| 0.7819444444444444 | 0 |
| 0.782638888888889 | 0 |
| 0.7833333333333333 | 0 |
| 0.7840277777777778 | 0 |
| 0.7847222222222222 | 0 |
| 0.7854166666666668 | 0 |
| 0.7861111111111111 | 0 |
| 0.7868055555555555 | 0 |
| 0.7875 | 0 |
| 0.7881944444444445 | 0 |
| 0.7888888888888889 | 0 |
| 0.7895833333333333 | 0 |
| 0.7902777777777777 | 0 |
| 0.7909722222222223 | 0 |
| 0.7916666666666666 | 0 |
| 0.7923611111111111 | 0 |
| 0.7930555555555556 | 0 |
| 0.7937500000000001 | 0 |
| 0.7944444444444444 | 0 |
| 0.7951388888888888 | 0 |
| 0.7958333333333334 | 0 |
| 0.7965277777777778 | 0 |
| 0.7972222222222222 | 0 |
| 0.7979166666666666 | 0 |
| 0.7986111111111112 | 0 |
| 0.7993055555555556 | 0 |
| 0.7999999999999999 | 0 |
| 0.8006944444444444 | 0 |
| 0.8013888888888889 | 0 |
| 0.8020833333333334 | 0 |
| 0.8027777777777777 | 0 |
| 0.8034722222222223 | 0 |
| 0.8041666666666667 | 0 |
| 0.8048611111111111 | 0 |
| 0.8055555555555555 | 0 |
| 0.80625 | 0 |
| 0.8069444444444445 | 0 |
| 0.8076388888888889 | 0 |
| 0.8083333333333332 | 0 |
| 0.8090277777777778 | 0 |
| 0.8097222222222222 | 0 |
| 0.8104166666666667 | 0 |
| 0.811111111111111 | 0 |
| 0.8118055555555556 | 0 |
| 0.8125 | 0 |
| 0.8131944444444444 | 0 |
| 0.813888888888889 | 0 |
| 0.8145833333333333 | 0 |
| 0.8152777777777778 | 0 |
| 0.8159722222222222 | 0 |
| 0.8166666666666668 | 0 |
| 0.8173611111111111 | 0 |
| 0.8180555555555555 | 0 |
| 0.81875 | 0 |
| 0.8194444444444445 | 0 |
| 0.8201388888888889 | 0 |
| 0.8208333333333333 | 0 |
| 0.8215277777777777 | 0 |
| 0.8222222222222223 | 0 |
| 0.8229166666666666 | 0 |
| 0.8236111111111111 | 0 |
| 0.8243055555555556 | 0 |
| 0.8250000000000001 | 0 |
| 0.8256944444444444 | 0 |
| 0.8263888888888888 | 0 |
| 0.8270833333333334 | 0 |
| 0.8277777777777778 | 0 |
| 0.8284722222222222 | 0 |
| 0.8291666666666666 | 0 |
| 0.8298611111111112 | 0 |
| 0.8305555555555556 | 0 |
| 0.8312499999999999 | 0 |
| 0.8319444444444444 | 0 |
| 0.8326388888888889 | 0 |
| 0.8333333333333334 | 0 |
| 0.8340277777777777 | 0 |
| 0.8347222222222223 | 0 |
| 0.8354166666666667 | 0 |
| 0.8361111111111111 | 0 |
| 0.8368055555555555 | 0 |
| 0.8375 | 0 |
| 0.8381944444444445 | 0 |
| 0.8388888888888889 | 0 |
| 0.8395833333333332 | 0 |
| 0.8402777777777778 | 0 |
| 0.8409722222222222 | 0 |
| 0.8416666666666667 | 0 |
| 0.842361111111111 | 0 |
| 0.8430555555555556 | 0 |
| 0.84375 | 0 |
| 0.8444444444444444 | 0 |
| 0.845138888888889 | 0 |
| 0.8458333333333333 | 0 |
| 0.8465277777777778 | 0 |
| 0.8472222222222222 | 0 |
| 0.8479166666666668 | 0 |
| 0.8486111111111111 | 0 |
| 0.8493055555555555 | 0 |
| 0.85 | 0 |
| 0.8506944444444445 | 0 |
| 0.8513888888888889 | 0 |
| 0.8520833333333333 | 0 |
| 0.8527777777777777 | 0 |
| 0.8534722222222223 | 0 |
| 0.8541666666666666 | 0 |
| 0.8548611111111111 | 0 |
| 0.8555555555555556 | 0 |
| 0.8562500000000001 | 0 |
| 0.8569444444444444 | 0 |
| 0.8576388888888888 | 0 |
| 0.8583333333333334 | 0 |
| 0.8590277777777778 | 0 |
| 0.8597222222222222 | 0 |
| 0.8604166666666666 | 0 |
| 0.8611111111111112 | 0 |
| 0.8618055555555556 | 0 |
| 0.8624999999999999 | 0 |
| 0.8631944444444444 | 0 |
| 0.8638888888888889 | 0 |
| 0.8645833333333334 | 0 |
| 0.8652777777777777 | 0 |
| 0.8659722222222223 | 0 |
| 0.8666666666666667 | 0 |
| 0.8673611111111111 | 0 |
| 0.8680555555555555 | 0 |
| 0.86875 | 0 |
| 0.8694444444444445 | 0 |
| 0.8701388888888889 | 0 |
| 0.8708333333333332 | 0 |
| 0.8715277777777778 | 0 |
| 0.8722222222222222 | 0 |
| 0.8729166666666667 | 0 |
| 0.873611111111111 | 0 |
| 0.8743055555555556 | 0 |
| 0.875 | 0 |
| 0.8756944444444444 | 0 |
| 0.876388888888889 | 0 |
| 0.8770833333333333 | 0 |
| 0.8777777777777778 | 0 |
| 0.8784722222222222 | 0 |
| 0.8791666666666668 | 0 |
| 0.8798611111111111 | 0 |
| 0.8805555555555555 | 0 |
| 0.88125 | 0 |
| 0.8819444444444445 | 0 |
| 0.8826388888888889 | 0 |
| 0.8833333333333333 | 0 |
| 0.8840277777777777 | 0 |
| 0.8847222222222223 | 0 |
| 0.8854166666666666 | 0 |
| 0.8861111111111111 | 0 |
| 0.8868055555555556 | 0 |
| 0.8875000000000001 | 0 |
| 0.8881944444444444 | 0 |
| 0.8888888888888888 | 0 |
| 0.8895833333333334 | 0 |
| 0.8902777777777778 | 0 |
| 0.8909722222222222 | 0 |
| 0.8916666666666666 | 0 |
| 0.8923611111111112 | 0 |
| 0.8930555555555556 | 0 |
| 0.8937499999999999 | 0 |
| 0.8944444444444444 | 0 |
| 0.8951388888888889 | 0 |
| 0.8958333333333334 | 0 |
| 0.8965277777777777 | 0 |
| 0.8972222222222223 | 0 |
| 0.8979166666666667 | 0 |
| 0.8986111111111111 | 0 |
| 0.8993055555555555 | 0 |
| 0.9 | 0 |
| 0.9006944444444445 | 0 |
| 0.9013888888888889 | 0 |
| 0.9020833333333332 | 0 |
| 0.9027777777777778 | 0 |
| 0.9034722222222222 | 0 |
| 0.9041666666666667 | 0 |
| 0.904861111111111 | 0 |
| 0.9055555555555556 | 0 |
| 0.90625 | 0 |
| 0.9069444444444444 | 0 |
| 0.907638888888889 | 0 |
| 0.9083333333333333 | 0 |
| 0.9090277777777778 | 0 |
| 0.9097222222222222 | 0 |
| 0.9104166666666668 | 0 |
| 0.9111111111111111 | 0 |
| 0.9118055555555555 | 0 |
| 0.9125 | 0 |
| 0.9131944444444445 | 0 |
| 0.9138888888888889 | 0 |
| 0.9145833333333333 | 0 |
| 0.9152777777777777 | 0 |
| 0.9159722222222223 | 0 |
| 0.9166666666666666 | 0 |
| 0.9173611111111111 | 0 |
| 0.9180555555555556 | 0 |
| 0.9187500000000001 | 0 |
| 0.9194444444444444 | 0 |
| 0.9201388888888888 | 0 |
| 0.9208333333333334 | 0 |
| 0.9215277777777778 | 0 |
| 0.9222222222222222 | 0 |
| 0.9229166666666666 | 0 |
| 0.9236111111111112 | 0 |
| 0.9243055555555556 | 0 |
| 0.9249999999999999 | 0 |
| 0.9256944444444444 | 0 |
| 0.9263888888888889 | 0 |
| 0.9270833333333334 | 0 |
| 0.9277777777777777 | 0 |
| 0.9284722222222223 | 0 |
| 0.9291666666666667 | 0 |
| 0.9298611111111111 | 0 |
| 0.9305555555555555 | 0 |
| 0.93125 | 0 |
| 0.9319444444444445 | 0 |
| 0.9326388888888889 | 0 |
| 0.9333333333333332 | 0 |
| 0.9340277777777778 | 0 |
| 0.9347222222222222 | 0 |
| 0.9354166666666667 | 0 |
| 0.936111111111111 | 0 |
| 0.9368055555555556 | 0 |
| 0.9375 | 0 |
| 0.9381944444444444 | 0 |
| 0.938888888888889 | 0 |
| 0.9395833333333333 | 0 |
| 0.9402777777777778 | 0 |
| 0.9409722222222222 | 0 |
| 0.9416666666666668 | 0 |
| 0.9423611111111111 | 0 |
| 0.9430555555555555 | 0 |
| 0.94375 | 0 |
| 0.9444444444444445 | 0 |
| 0.9451388888888889 | 0 |
| 0.9458333333333333 | 0 |
| 0.9465277777777777 | 0 |
| 0.9472222222222223 | 0 |
| 0.9479166666666666 | 0 |
| 0.9486111111111111 | 0 |
| 0.9493055555555556 | 0 |
| 0.9500000000000001 | 0 |
| 0.9506944444444444 | 0 |
| 0.9513888888888888 | 0 |
| 0.9520833333333334 | 0 |
| 0.9527777777777778 | 0 |
| 0.9534722222222222 | 0 |
| 0.9541666666666666 | 0 |
| 0.9548611111111112 | 0 |
| 0.9555555555555556 | 0 |
| 0.9562499999999999 | 0 |
| 0.9569444444444444 | 0 |
| 0.9576388888888889 | 0 |
| 0.9583333333333334 | 0 |
| 0.9590277777777777 | 0 |
| 0.9597222222222223 | 0 |
| 0.9604166666666667 | 0 |
| 0.9611111111111111 | 0 |
| 0.9618055555555555 | 0 |
| 0.9625 | 0 |
| 0.9631944444444445 | 0 |
| 0.9638888888888889 | 0 |
| 0.9645833333333332 | 0 |
| 0.9652777777777778 | 0 |
| 0.9659722222222222 | 0 |
| 0.9666666666666667 | 0 |
| 0.967361111111111 | 0 |
| 0.9680555555555556 | 0 |
| 0.96875 | 0 |
| 0.9694444444444444 | 0 |
| 0.970138888888889 | 0 |
| 0.9708333333333333 | 0 |
| 0.9715277777777778 | 0 |
| 0.9722222222222222 | 0 |
| 0.9729166666666668 | 0 |
| 0.9736111111111111 | 0 |
| 0.9743055555555555 | 0 |
| 0.975 | 0 |
| 0.9756944444444445 | 0 |
| 0.9763888888888889 | 0 |
| 0.9770833333333333 | 0 |
| 0.9777777777777777 | 0 |
| 0.9784722222222223 | 0 |
| 0.9791666666666666 | 0 |
| 0.9798611111111111 | 0 |
| 0.9805555555555556 | 0 |
| 0.9812500000000001 | 0 |
| 0.9819444444444444 | 0 |
| 0.9826388888888888 | 0 |
| 0.9833333333333334 | 0 |
| 0.9840277777777778 | 0 |
| 0.9847222222222222 | 0 |
| 0.9854166666666666 | 0 |
| 0.9861111111111112 | 0 |
| 0.9868055555555556 | 0 |
| 0.9874999999999999 | 0 |
| 0.9881944444444444 | 0 |
| 0.9888888888888889 | 0 |
| 0.9895833333333334 | 0 |
| 0.9902777777777777 | 0 |
| 0.9909722222222223 | 0 |
| 0.9916666666666667 | 0 |
| 0.9923611111111111 | 0 |
| 0.9930555555555555 | 0 |
| 0.99375 | 0 |
| 0.9944444444444445 | 0 |
| 0.9951388888888889 | 0 |
| 0.9958333333333332 | 0 |
| 0.9965277777777778 | 0 |
| 0.9972222222222222 | 0 |
| 0.9979166666666667 | 0 |
| 0.998611111111111 | 0 |
| 0.9993055555555556 | 0 |